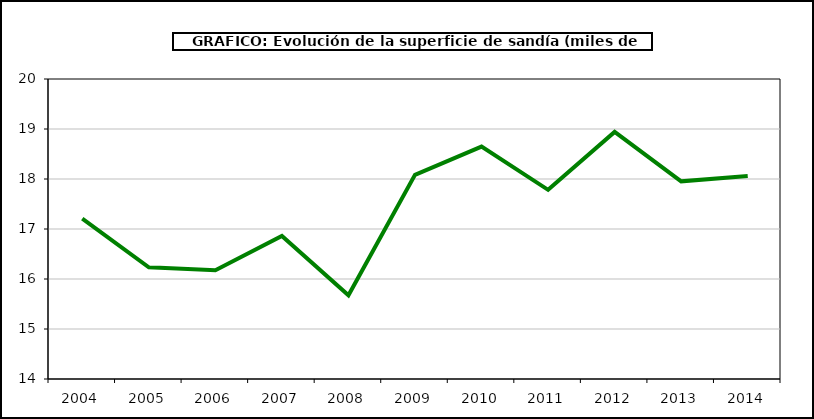
| Category | superficie |
|---|---|
| 2004.0 | 17.209 |
| 2005.0 | 16.235 |
| 2006.0 | 16.174 |
| 2007.0 | 16.861 |
| 2008.0 | 15.674 |
| 2009.0 | 18.082 |
| 2010.0 | 18.648 |
| 2011.0 | 17.783 |
| 2012.0 | 18.942 |
| 2013.0 | 17.953 |
| 2014.0 | 18.059 |